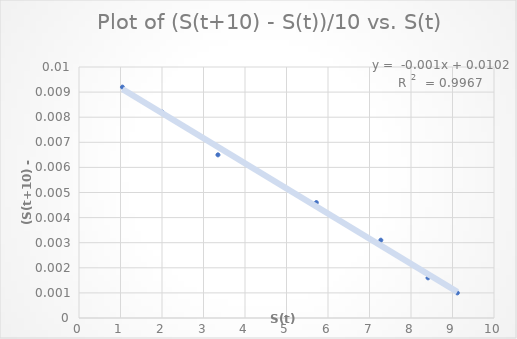
| Category | Series 0 |
|---|---|
| 1.047 | 0.009 |
| 2.005 | 0.008 |
| 3.348 | 0.006 |
| 5.719 | 0.005 |
| 7.273 | 0.003 |
| 8.41 | 0.002 |
| 9.117 | 0.001 |